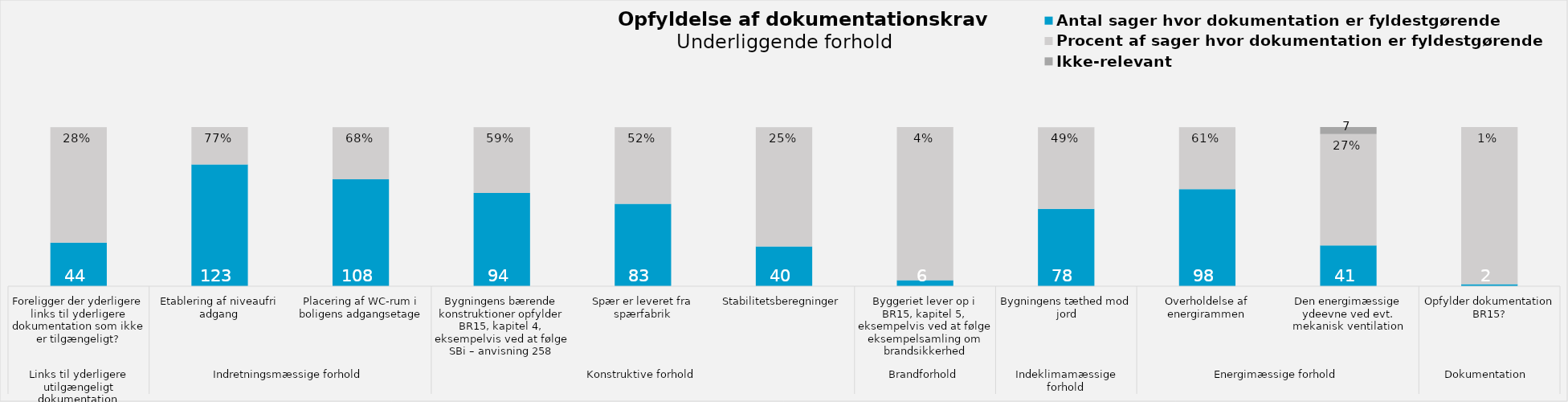
| Category | Antal sager hvor dokumentation er fyldestgørende | Procent af sager hvor dokumentation er fyldestgørende | %-andel | Ikke-relevant |
|---|---|---|---|---|
| 0 | 44 | 116 | 0.275 | 0 |
| 1 | 123 | 37 | 0.769 | 0 |
| 2 | 108 | 52 | 0.675 | 0 |
| 3 | 94 | 66 | 0.588 | 0 |
| 4 | 83 | 77 | 0.519 | 0 |
| 5 | 40 | 120 | 0.25 | 0 |
| 6 | 6 | 154 | 0.038 | 0 |
| 7 | 78 | 82 | 0.488 | 0 |
| 8 | 98 | 62 | 0.612 | 0 |
| 9 | 41 | 112 | 0.268 | 7 |
| 10 | 2 | 158 | 0.012 | 0 |